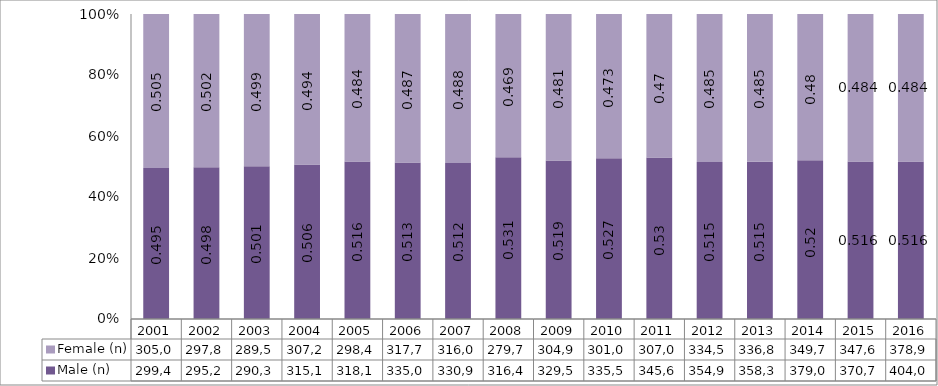
| Category | Male (n) | Female (n) |
|---|---|---|
| 2001.0 | 299408 | 305050 |
| 2002.0 | 295277 | 297898 |
| 2003.0 | 290339 | 289587 |
| 2004.0 | 315174 | 307232 |
| 2005.0 | 318179 | 298441 |
| 2006.0 | 335021 | 317702 |
| 2007.0 | 330917 | 316027 |
| 2008.0 | 316423 | 279788 |
| 2009.0 | 329588 | 304978 |
| 2010.0 | 335524 | 301053 |
| 2011.0 | 345683 | 307013 |
| 2012.0 | 354917 | 334537 |
| 2013.0 | 358353 | 336823 |
| 2014.0 | 379017 | 349708 |
| 2015.0 | 370756 | 347611 |
| 2016.0 | 404035 | 378902 |